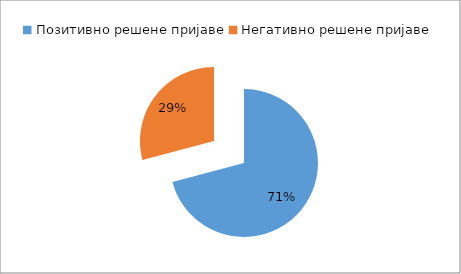
| Category | Series 0 |
|---|---|
| Позитивно решене пријаве | 0.709 |
| Негативно решене пријаве | 0.291 |